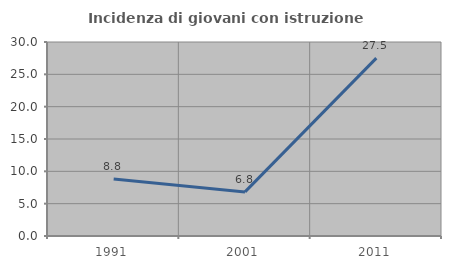
| Category | Incidenza di giovani con istruzione universitaria |
|---|---|
| 1991.0 | 8.824 |
| 2001.0 | 6.818 |
| 2011.0 | 27.5 |